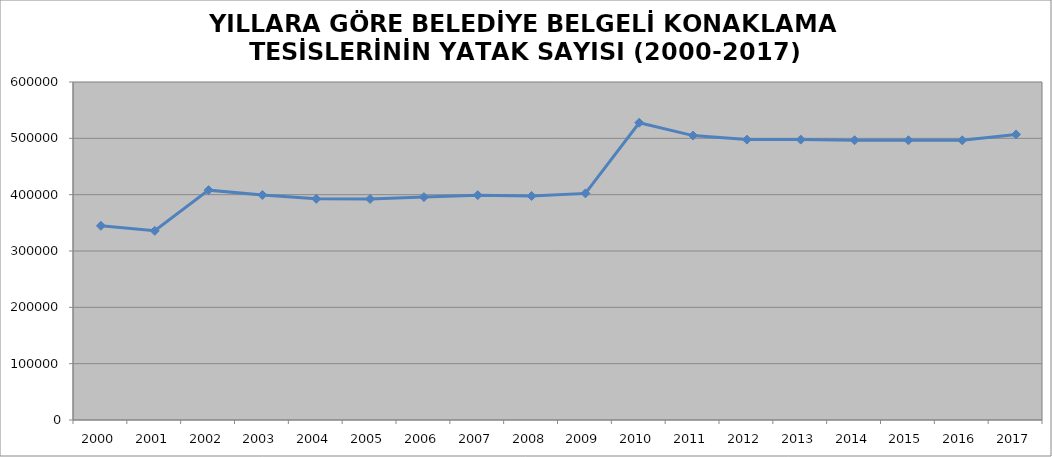
| Category | BELEDİYE BELGELİ TESİSLER |
|---|---|
| 2000 | 344736 |
| 2001 | 335825 |
| 2002 | 408005 |
| 2003 | 399369 |
| 2004 | 392582 |
| 2005 | 392338 |
| 2006 | 395671 |
| 2007 | 399110 |
| 2008 | 397684 |
| 2009 | 402289 |
| 2010 | 527712 |
| 2011 | 504877 |
| 2012 | 497728 |
| 2013 | 497728 |
| 2014 | 496697 |
| 2015 | 496574 |
| 2016 | 496538 |
| 2017 | 506934 |